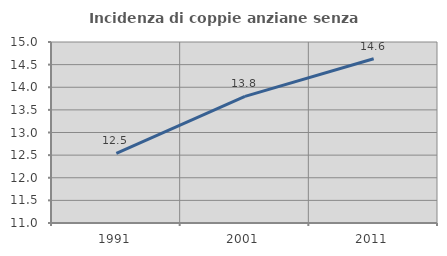
| Category | Incidenza di coppie anziane senza figli  |
|---|---|
| 1991.0 | 12.537 |
| 2001.0 | 13.798 |
| 2011.0 | 14.631 |